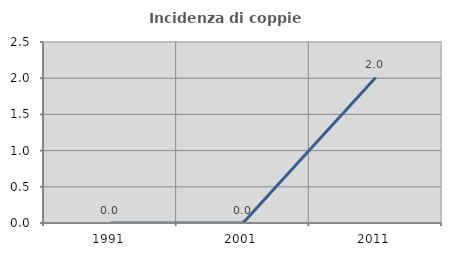
| Category | Incidenza di coppie miste |
|---|---|
| 1991.0 | 0 |
| 2001.0 | 0 |
| 2011.0 | 2.01 |